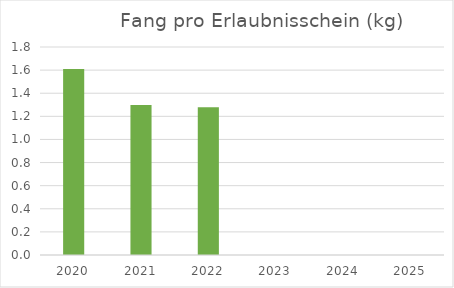
| Category | Fang pro Erlaubnisschein |
|---|---|
| 2020.0 | 1.609 |
| 2021.0 | 1.299 |
| 2022.0 | 1.279 |
| 2023.0 | 0 |
| 2024.0 | 0 |
| 2025.0 | 0 |